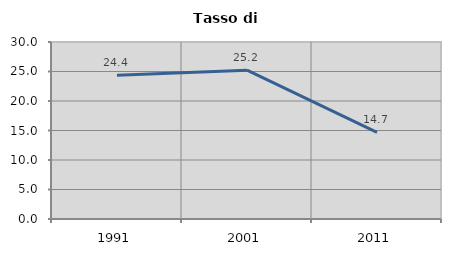
| Category | Tasso di disoccupazione   |
|---|---|
| 1991.0 | 24.351 |
| 2001.0 | 25.219 |
| 2011.0 | 14.697 |